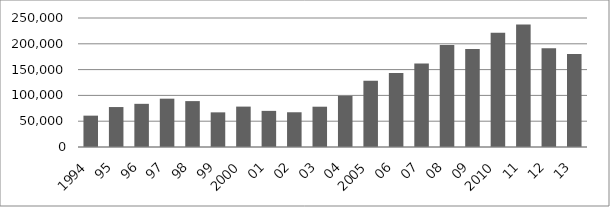
| Category | faturamento por empregado |
|---|---|
| 1994 | 60760.778 |
| 95 | 77422.969 |
| 96 | 83663.726 |
| 97 | 93658.798 |
| 98 | 88940.12 |
| 99 | 67143.713 |
| 2000 | 78288.235 |
| 01 | 70017.647 |
| 02 | 67315.476 |
| 03 | 78090.217 |
| 04 | 99187.166 |
| 2005 | 128564.885 |
| 06 | 143457.286 |
| 07 | 161585.253 |
| 08 | 197551.807 |
| 09 | 189949.875 |
| 2010 | 221580.588 |
| 11 | 237318.241 |
| 12 | 191299.177 |
| 13 | 180459.091 |